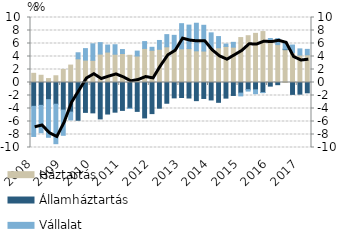
| Category | Háztartás | Államháztartás | Vállalat |
|---|---|---|---|
| 2008.0 | 1.412 | -3.665 | -4.638 |
| 2008.0 | 1.112 | -3.515 | -4.211 |
| 2008.0 | 0.606 | -2.637 | -5.794 |
| 2008.0 | 1.037 | -3.34 | -6.075 |
| 2009.0 | 2.006 | -4.242 | -3.88 |
| 2009.0 | 2.679 | -4.556 | -1.202 |
| 2009.0 | 3.64 | -5.811 | 0.933 |
| 2009.0 | 3.446 | -4.597 | 1.766 |
| 2010.0 | 3.416 | -4.672 | 2.532 |
| 2010.0 | 4.377 | -5.599 | 1.755 |
| 2010.0 | 4.683 | -4.851 | 1.077 |
| 2010.0 | 4.353 | -4.565 | 1.456 |
| 2011.0 | 4.461 | -4.292 | 0.611 |
| 2011.0 | 4.184 | -3.975 | -0.029 |
| 2011.0 | 4.079 | -4.443 | 0.752 |
| 2011.0 | 5.243 | -5.451 | 1.051 |
| 2012.0 | 4.958 | -4.785 | 0.459 |
| 2012.0 | 5.11 | -3.954 | 1.357 |
| 2012.0 | 5.492 | -3.192 | 1.873 |
| 2012.0 | 5.051 | -2.366 | 2.202 |
| 2013.0 | 5.181 | -2.306 | 3.869 |
| 2013.0 | 5.209 | -2.388 | 3.621 |
| 2013.0 | 4.874 | -2.792 | 4.244 |
| 2013.0 | 4.841 | -2.456 | 3.961 |
| 2014.0 | 5.226 | -2.685 | 2.413 |
| 2014.0 | 5.345 | -3.05 | 1.721 |
| 2014.0 | 5.551 | -2.403 | 0.365 |
| 2014.0 | 5.438 | -1.995 | 0.74 |
| 2015.0 | 6.916 | -1.631 | -0.428 |
| 2015.0 | 7.201 | -1.101 | -0.219 |
| 2015.0 | 7.559 | -1.127 | -0.594 |
| 2015.0 | 7.836 | -1.549 | -0.001 |
| 2016.0 | 6.195 | -0.557 | 0.579 |
| 2016.0 | 5.823 | -0.337 | 0.927 |
| 2016.0 | 5.056 | 0.083 | 0.96 |
| 2016.0 | 4.591 | -1.828 | 1.171 |
| 2017.0 | 4.222 | -1.792 | 0.95 |
| nan | 4.254 | -1.587 | 0.843 |